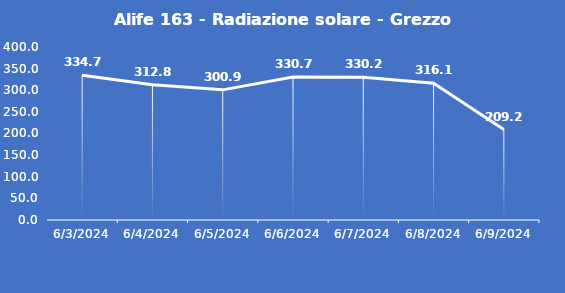
| Category | Alife 163 - Radiazione solare - Grezzo (W/m2) |
|---|---|
| 6/3/24 | 334.7 |
| 6/4/24 | 312.8 |
| 6/5/24 | 300.9 |
| 6/6/24 | 330.7 |
| 6/7/24 | 330.2 |
| 6/8/24 | 316.1 |
| 6/9/24 | 209.2 |